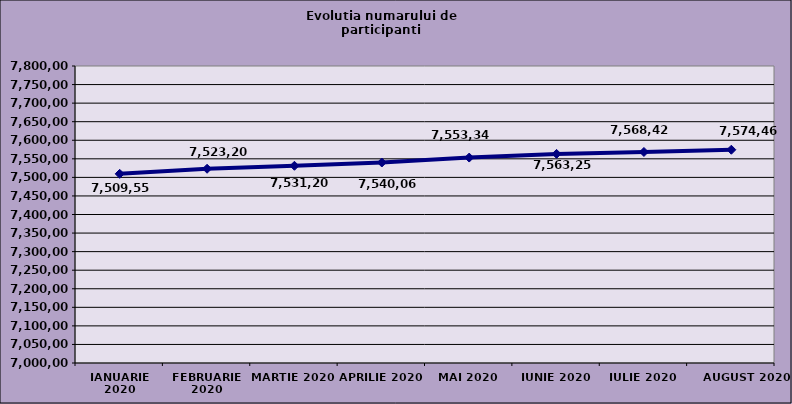
| Category | Series 0 |
|---|---|
| IANUARIE 2020 | 7509558 |
| FEBRUARIE 2020 | 7523201 |
| MARTIE 2020 | 7531201 |
| APRILIE 2020 | 7540064 |
| MAI 2020 | 7553346 |
| IUNIE 2020 | 7563259 |
| IULIE 2020 | 7568421 |
| AUGUST 2020 | 7574466 |